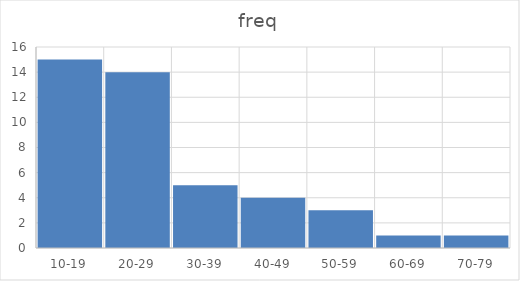
| Category | freq |
|---|---|
| 10-19 | 15 |
| 20-29 | 14 |
| 30-39 | 5 |
| 40-49 | 4 |
| 50-59 | 3 |
| 60-69 | 1 |
| 70-79 | 1 |